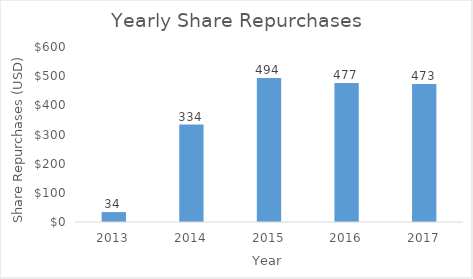
| Category | Series 0 |
|---|---|
| 2013.0 | 34 |
| 2014.0 | 334 |
| 2015.0 | 494 |
| 2016.0 | 477 |
| 2017.0 | 473 |